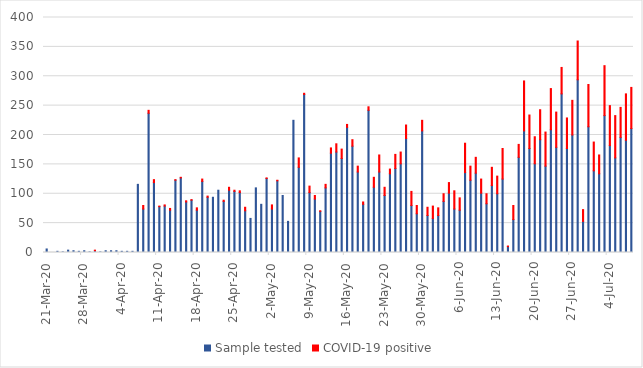
| Category | Sample tested | COVID-19 positive |
|---|---|---|
| 2020-03-21 | 6 | 0 |
| 2020-03-22 | 0 | 0 |
| 2020-03-23 | 2 | 0 |
| 2020-03-24 | 1 | 0 |
| 2020-03-25 | 4 | 0 |
| 2020-03-26 | 3 | 0 |
| 2020-03-27 | 2 | 0 |
| 2020-03-28 | 3 | 0 |
| 2020-03-29 | 1 | 0 |
| 2020-03-30 | 3 | 1 |
| 2020-03-31 | 1 | 0 |
| 2020-04-01 | 3 | 0 |
| 2020-04-02 | 3 | 0 |
| 2020-04-03 | 3 | 0 |
| 2020-04-04 | 2 | 0 |
| 2020-04-05 | 2 | 0 |
| 2020-04-06 | 2 | 0 |
| 2020-04-07 | 116 | 0 |
| 2020-04-08 | 74 | 6 |
| 2020-04-09 | 237 | 5 |
| 2020-04-10 | 119 | 5 |
| 2020-04-11 | 78 | 1 |
| 2020-04-12 | 79 | 2 |
| 2020-04-13 | 72 | 3 |
| 2020-04-14 | 123 | 1 |
| 2020-04-15 | 127 | 1 |
| 2020-04-16 | 86 | 2 |
| 2020-04-17 | 89 | 1 |
| 2020-04-18 | 72 | 4 |
| 2020-04-19 | 121 | 4 |
| 2020-04-20 | 94 | 2 |
| 2020-04-21 | 94 | 0 |
| 2020-04-22 | 106 | 0 |
| 2020-04-23 | 87 | 2 |
| 2020-04-24 | 106 | 5 |
| 2020-04-25 | 104 | 2 |
| 2020-04-26 | 102 | 3 |
| 2020-04-27 | 71 | 6 |
| 2020-04-28 | 58 | 0 |
| 2020-04-29 | 110 | 0 |
| 2020-04-30 | 82 | 0 |
| 2020-05-01 | 126 | 1 |
| 2020-05-02 | 74 | 7 |
| 2020-05-03 | 122 | 1 |
| 2020-05-04 | 97 | 0 |
| 2020-05-05 | 53 | 0 |
| 2020-05-06 | 225 | 0 |
| 2020-05-07 | 145 | 16 |
| 2020-05-08 | 269 | 2 |
| 2020-05-09 | 102 | 11 |
| 2020-05-10 | 91 | 6 |
| 2020-05-11 | 70 | 1 |
| 2020-05-12 | 110 | 6 |
| 2020-05-13 | 169 | 9 |
| 2020-05-14 | 171 | 14 |
| 2020-05-15 | 160 | 16 |
| 2020-05-16 | 213 | 5 |
| 2020-05-17 | 181 | 11 |
| 2020-05-18 | 137 | 10 |
| 2020-05-19 | 82 | 4 |
| 2020-05-20 | 242 | 6 |
| 2020-05-21 | 111 | 17 |
| 2020-05-22 | 137 | 29 |
| 2020-05-23 | 97 | 14 |
| 2020-05-24 | 134 | 8 |
| 2020-05-25 | 143 | 24 |
| 2020-05-26 | 151 | 20 |
| 2020-05-27 | 194 | 23 |
| 2020-05-28 | 80 | 24 |
| 2020-05-29 | 66 | 14 |
| 2020-05-30 | 207 | 18 |
| 2020-05-31 | 63 | 14 |
| 2020-06-01 | 58 | 21 |
| 2020-06-02 | 63 | 13 |
| 2020-06-03 | 87 | 13 |
| 2020-06-04 | 101 | 18 |
| 2020-06-05 | 74 | 31 |
| 2020-06-06 | 72 | 21 |
| 2020-06-07 | 136 | 50 |
| 2020-06-08 | 123 | 24 |
| 2020-06-09 | 135 | 27 |
| 2020-06-10 | 101 | 24 |
| 2020-06-11 | 83 | 17 |
| 2020-06-12 | 114 | 31 |
| 2020-06-13 | 100 | 30 |
| 2020-06-14 | 125 | 52 |
| 2020-06-15 | 10 | 1 |
| 2020-06-16 | 56 | 24 |
| 2020-06-17 | 162 | 22 |
| 2020-06-18 | 207 | 85 |
| 2020-06-19 | 177 | 57 |
| 2020-06-20 | 151 | 46 |
| 2020-06-21 | 192 | 51 |
| 2020-06-22 | 147 | 58 |
| 2020-06-23 | 209 | 70 |
| 2020-06-24 | 179 | 60 |
| 2020-06-25 | 270 | 45 |
| 2020-06-26 | 177 | 52 |
| 2020-06-27 | 200 | 59 |
| 2020-06-28 | 294 | 66 |
| 2020-06-29 | 53 | 20 |
| 2020-06-30 | 214 | 72 |
| 2020-07-01 | 139 | 49 |
| 2020-07-02 | 134 | 32 |
| 2020-07-03 | 233 | 85 |
| 2020-07-04 | 182 | 68 |
| 2020-07-05 | 161 | 72 |
| 2020-07-06 | 196 | 51 |
| 2020-07-07 | 191 | 79 |
| 2020-07-08 | 211 | 70 |